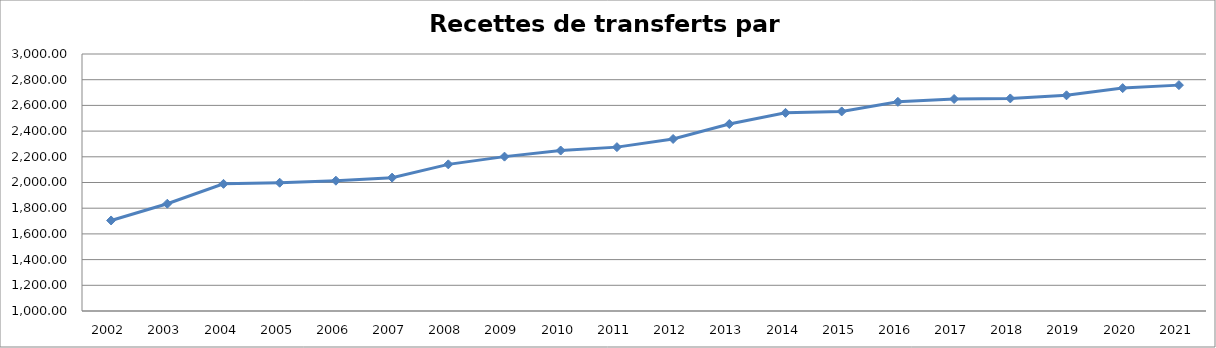
| Category | Series 0 |
|---|---|
| 2002.0 | 1704.626 |
| 2003.0 | 1834.773 |
| 2004.0 | 1989.475 |
| 2005.0 | 1998.261 |
| 2006.0 | 2014.026 |
| 2007.0 | 2037.83 |
| 2008.0 | 2141.192 |
| 2009.0 | 2201.325 |
| 2010.0 | 2248.806 |
| 2011.0 | 2275.289 |
| 2012.0 | 2338.789 |
| 2013.0 | 2455.227 |
| 2014.0 | 2542.006 |
| 2015.0 | 2552.985 |
| 2016.0 | 2627.65 |
| 2017.0 | 2649.811 |
| 2018.0 | 2654.084 |
| 2019.0 | 2678.607 |
| 2020.0 | 2734.632 |
| 2021.0 | 2757.782 |